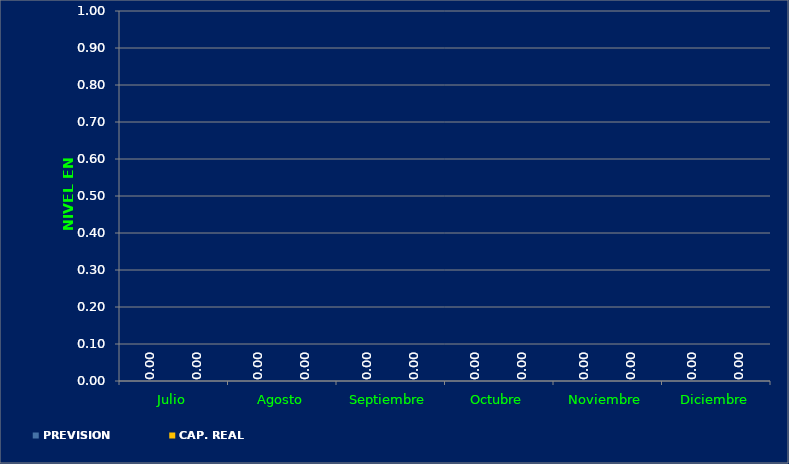
| Category | PREVISION | CAP. REAL |
|---|---|---|
| Julio | 0 | 0 |
| Agosto | 0 | 0 |
| Septiembre | 0 | 0 |
| Octubre | 0 | 0 |
| Noviembre | 0 | 0 |
| Diciembre | 0 | 0 |